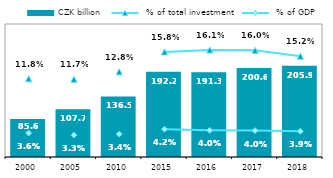
| Category | CZK billion |
|---|---|
| 2000.0 | 85.6 |
| 2005.0 | 107.746 |
| 2010.0 | 136.519 |
| 2015.0 | 192.247 |
| 2016.0 | 191.276 |
| 2017.0 | 200.568 |
| 2018.0 | 205.933 |